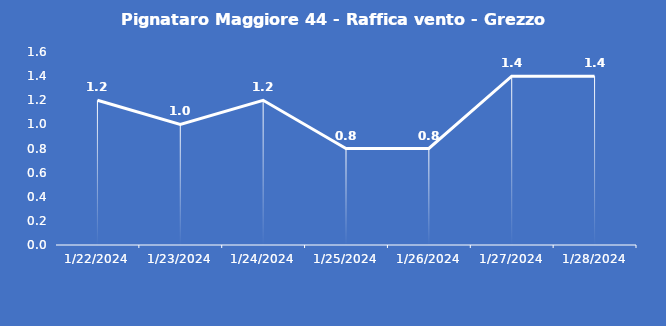
| Category | Pignataro Maggiore 44 - Raffica vento - Grezzo (m/s) |
|---|---|
| 1/22/24 | 1.2 |
| 1/23/24 | 1 |
| 1/24/24 | 1.2 |
| 1/25/24 | 0.8 |
| 1/26/24 | 0.8 |
| 1/27/24 | 1.4 |
| 1/28/24 | 1.4 |